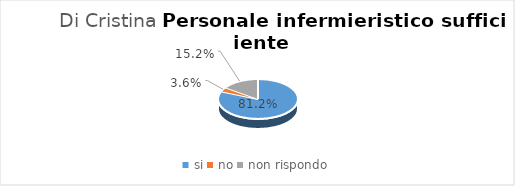
| Category | Di Cristina (Ospedale dei Bambini) - Osp -  Palermo - PA |
|---|---|
| si | 0.812 |
| no | 0.036 |
| non rispondo | 0.152 |